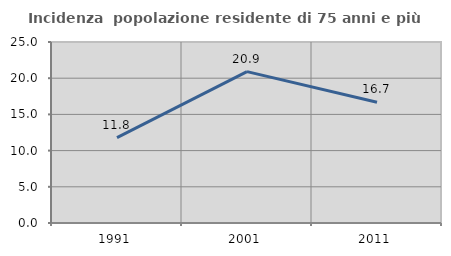
| Category | Incidenza  popolazione residente di 75 anni e più |
|---|---|
| 1991.0 | 11.787 |
| 2001.0 | 20.909 |
| 2011.0 | 16.667 |